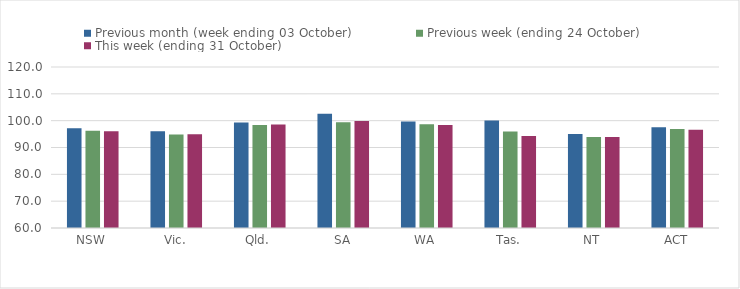
| Category | Previous month (week ending 03 October) | Previous week (ending 24 October) | This week (ending 31 October) |
|---|---|---|---|
| NSW | 97.22 | 96.21 | 96.05 |
| Vic. | 96.04 | 94.83 | 94.93 |
| Qld. | 99.33 | 98.38 | 98.59 |
| SA | 102.61 | 99.43 | 99.89 |
| WA | 99.65 | 98.67 | 98.38 |
| Tas. | 100.07 | 95.96 | 94.31 |
| NT | 95 | 93.95 | 93.92 |
| ACT | 97.59 | 96.87 | 96.61 |